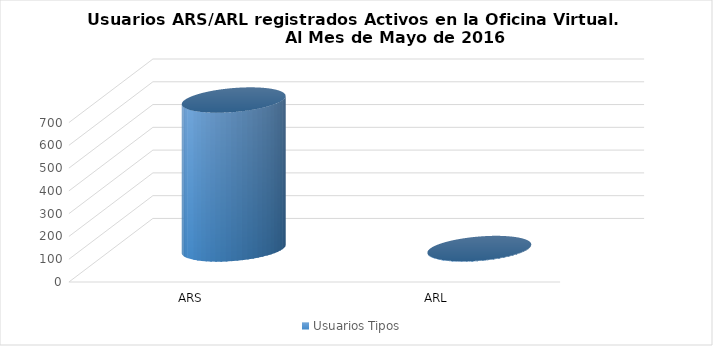
| Category | Usuarios Tipos |
|---|---|
| ARS | 654 |
| ARL | 2 |